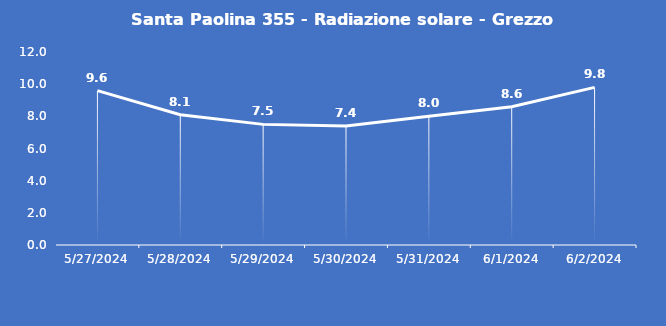
| Category | Santa Paolina 355 - Radiazione solare - Grezzo (W/m2) |
|---|---|
| 5/27/24 | 9.6 |
| 5/28/24 | 8.1 |
| 5/29/24 | 7.5 |
| 5/30/24 | 7.4 |
| 5/31/24 | 8 |
| 6/1/24 | 8.6 |
| 6/2/24 | 9.8 |